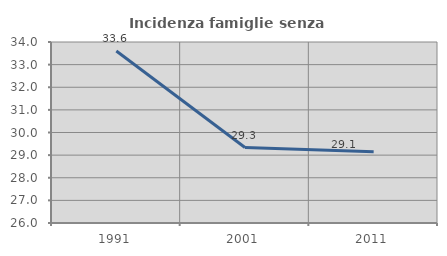
| Category | Incidenza famiglie senza nuclei |
|---|---|
| 1991.0 | 33.604 |
| 2001.0 | 29.335 |
| 2011.0 | 29.146 |